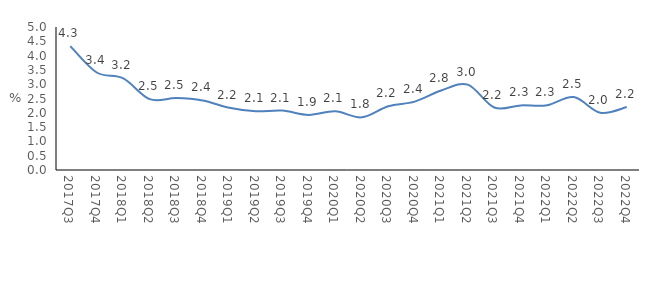
| Category | 2017Q3 |
|---|---|
| 2017Q3 | 4.333 |
| 2017Q4 | 3.409 |
| 2018Q1 | 3.202 |
| 2018Q2 | 2.477 |
| 2018Q3 | 2.517 |
| 2018Q4 | 2.43 |
| 2019Q1 | 2.177 |
| 2019Q2 | 2.052 |
| 2019Q3 | 2.078 |
| 2019Q4 | 1.927 |
| 2020Q1 | 2.052 |
| 2020Q2 | 1.842 |
| 2020Q3 | 2.229 |
| 2020Q4 | 2.392 |
| 2021Q1 | 2.778 |
| 2021Q2 | 2.985 |
| 2021Q3 | 2.185 |
| 2021Q4 | 2.259 |
| 2022Q1 | 2.263 |
| 2022Q2 | 2.55 |
| 2022Q3 | 2 |
| 2022Q4 | 2.2 |